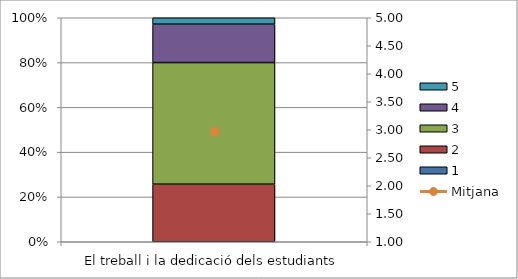
| Category | 1 | 2 | 3 | 4 | 5 |
|---|---|---|---|---|---|
| El treball i la dedicació dels estudiants | 0 | 9 | 19 | 6 | 1 |